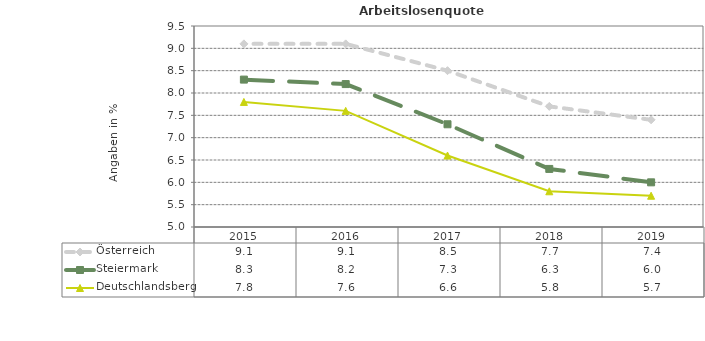
| Category | Österreich | Steiermark | Deutschlandsberg |
|---|---|---|---|
| 2019.0 | 7.4 | 6 | 5.7 |
| 2018.0 | 7.7 | 6.3 | 5.8 |
| 2017.0 | 8.5 | 7.3 | 6.6 |
| 2016.0 | 9.1 | 8.2 | 7.6 |
| 2015.0 | 9.1 | 8.3 | 7.8 |